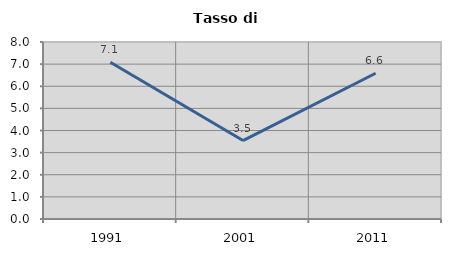
| Category | Tasso di disoccupazione   |
|---|---|
| 1991.0 | 7.084 |
| 2001.0 | 3.546 |
| 2011.0 | 6.588 |